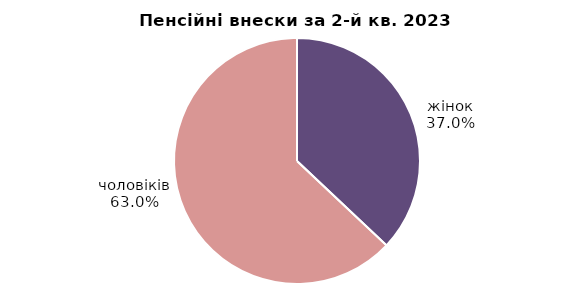
| Category | Series 0 |
|---|---|
| жінок | 20.183 |
| чоловіків | 34.323 |